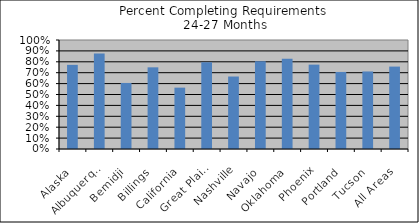
| Category | % Comp. Req. |
|---|---|
| Alaska | 0.772 |
| Albuquerque | 0.876 |
| Bemidji | 0.606 |
| Billings | 0.749 |
| California | 0.563 |
| Great Plains | 0.796 |
| Nashville | 0.665 |
| Navajo | 0.806 |
| Oklahoma | 0.829 |
| Phoenix | 0.774 |
| Portland | 0.707 |
| Tucson | 0.711 |
| All Areas | 0.756 |